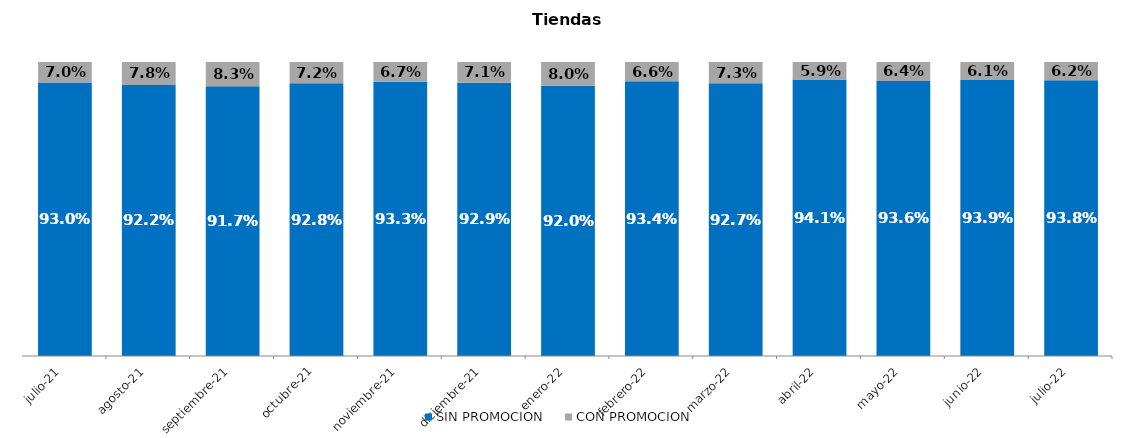
| Category | SIN PROMOCION   | CON PROMOCION   |
|---|---|---|
| 2021-07-01 | 0.93 | 0.07 |
| 2021-08-01 | 0.922 | 0.078 |
| 2021-09-01 | 0.917 | 0.083 |
| 2021-10-01 | 0.928 | 0.072 |
| 2021-11-01 | 0.933 | 0.067 |
| 2021-12-01 | 0.929 | 0.071 |
| 2022-01-01 | 0.92 | 0.08 |
| 2022-02-01 | 0.934 | 0.066 |
| 2022-03-01 | 0.927 | 0.073 |
| 2022-04-01 | 0.941 | 0.059 |
| 2022-05-01 | 0.936 | 0.064 |
| 2022-06-01 | 0.939 | 0.061 |
| 2022-07-01 | 0.938 | 0.062 |